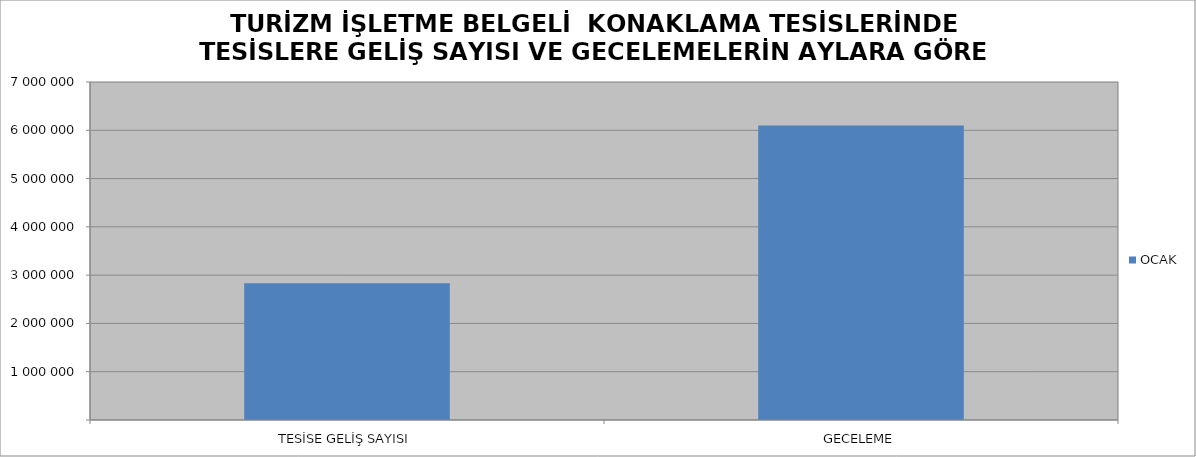
| Category | OCAK |
|---|---|
| TESİSE GELİŞ SAYISI | 2833509 |
| GECELEME | 6098050 |